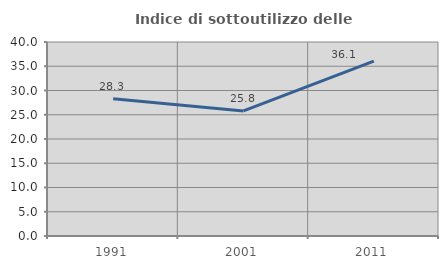
| Category | Indice di sottoutilizzo delle abitazioni  |
|---|---|
| 1991.0 | 28.315 |
| 2001.0 | 25.779 |
| 2011.0 | 36.066 |